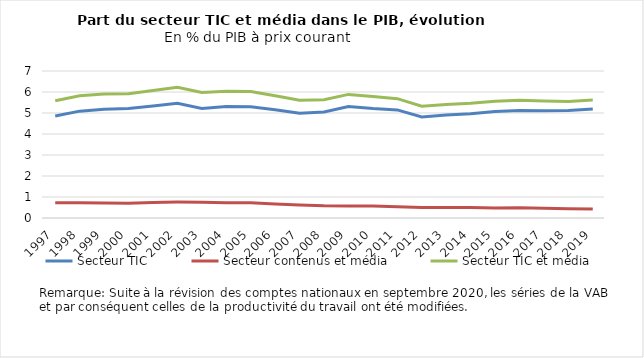
| Category | Secteur TIC | Secteur contenus et média | Secteur TIC et média |
|---|---|---|---|
| 1997.0 | 4.855 | 0.729 | 5.585 |
| 1998.0 | 5.088 | 0.729 | 5.817 |
| 1999.0 | 5.18 | 0.72 | 5.9 |
| 2000.0 | 5.215 | 0.704 | 5.919 |
| 2001.0 | 5.331 | 0.739 | 6.071 |
| 2002.0 | 5.461 | 0.759 | 6.22 |
| 2003.0 | 5.22 | 0.754 | 5.974 |
| 2004.0 | 5.31 | 0.728 | 6.038 |
| 2005.0 | 5.301 | 0.721 | 6.023 |
| 2006.0 | 5.156 | 0.667 | 5.823 |
| 2007.0 | 4.991 | 0.619 | 5.609 |
| 2008.0 | 5.047 | 0.583 | 5.63 |
| 2009.0 | 5.312 | 0.574 | 5.886 |
| 2010.0 | 5.216 | 0.568 | 5.784 |
| 2011.0 | 5.147 | 0.537 | 5.684 |
| 2012.0 | 4.815 | 0.505 | 5.32 |
| 2013.0 | 4.904 | 0.499 | 5.403 |
| 2014.0 | 4.959 | 0.502 | 5.461 |
| 2015.0 | 5.075 | 0.48 | 5.555 |
| 2016.0 | 5.119 | 0.485 | 5.603 |
| 2017.0 | 5.108 | 0.464 | 5.572 |
| 2018.0 | 5.113 | 0.44 | 5.553 |
| 2019.0 | 5.188 | 0.427 | 5.615 |